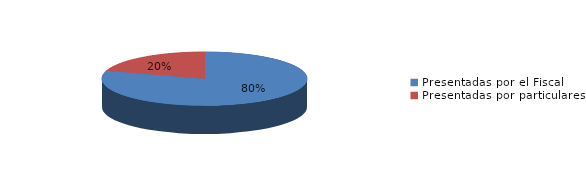
| Category | Series 0 |
|---|---|
| Presentadas por el Fiscal | 522 |
| Presentadas por particulares | 132 |